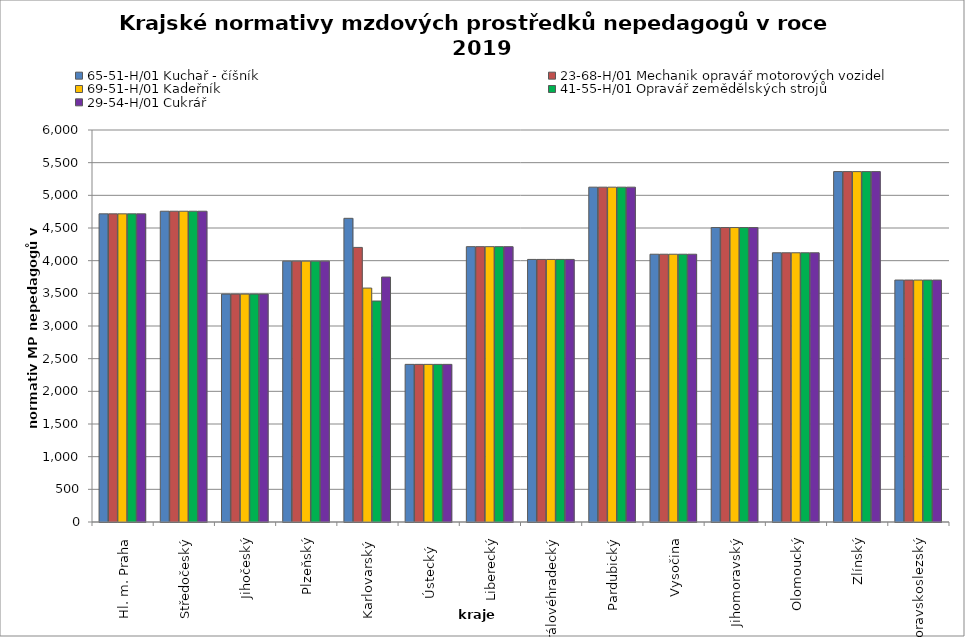
| Category | 65-51-H/01 Kuchař - číšník | 23-68-H/01 Mechanik opravář motorových vozidel | 69-51-H/01 Kadeřník | 41-55-H/01 Opravář zemědělských strojů | 29-54-H/01 Cukrář |
|---|---|---|---|---|---|
| Hl. m. Praha | 4716.774 | 4716.774 | 4716.774 | 4716.774 | 4716.774 |
| Středočeský | 4756.8 | 4756.8 | 4756.8 | 4756.8 | 4756.8 |
| Jihočeský | 3488.344 | 3488.344 | 3488.344 | 3488.344 | 3488.344 |
| Plzeňský | 3992.727 | 3992.727 | 3992.727 | 3992.727 | 3992.727 |
| Karlovarský  | 4648.13 | 4202.934 | 3580.502 | 3382.404 | 3749.42 |
| Ústecký   | 2412.866 | 2412.866 | 2412.866 | 2412.866 | 2412.866 |
| Liberecký | 4214.357 | 4214.357 | 4214.357 | 4214.357 | 4214.357 |
| Královéhradecký | 4018.825 | 4018.825 | 4018.825 | 4018.825 | 4018.825 |
| Pardubický | 5125.091 | 5125.091 | 5125.091 | 5125.091 | 5125.091 |
| Vysočina | 4098.617 | 4098.617 | 4098.617 | 4098.617 | 4098.617 |
| Jihomoravský | 4506.792 | 4506.792 | 4506.792 | 4506.792 | 4506.792 |
| Olomoucký | 4120.751 | 4120.751 | 4120.751 | 4120.751 | 4120.751 |
| Zlínský | 5363.265 | 5363.265 | 5363.265 | 5363.265 | 5363.265 |
| Moravskoslezský | 3703.244 | 3703.244 | 3703.244 | 3703.244 | 3703.244 |